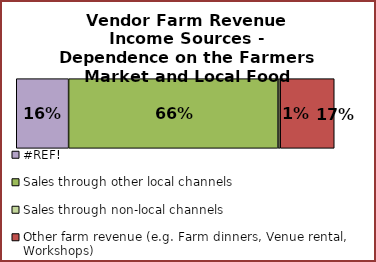
| Category | #REF! | Sales through other local channels | Sales through non-local channels | Other farm revenue (e.g. Farm dinners, Venue rental, Workshops) |
|---|---|---|---|---|
| 0 | 0.165 | 0.658 | 0.007 | 0.17 |